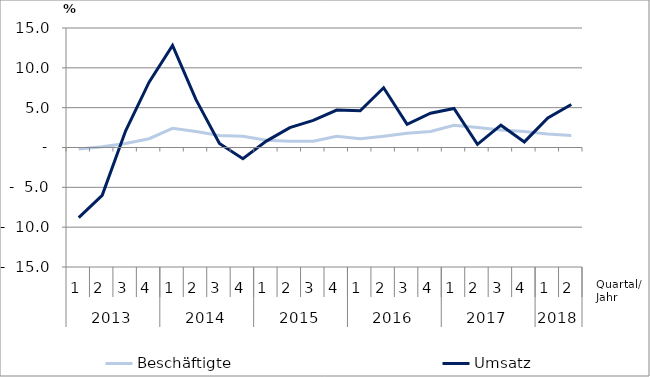
| Category | Beschäftigte | Umsatz |
|---|---|---|
| 0 | -0.2 | -8.8 |
| 1 | 0.1 | -6 |
| 2 | 0.5 | 2.1 |
| 3 | 1.1 | 8.2 |
| 4 | 2.4 | 12.8 |
| 5 | 2 | 6 |
| 6 | 1.5 | 0.5 |
| 7 | 1.4 | -1.4 |
| 8 | 0.9 | 0.8 |
| 9 | 0.8 | 2.5 |
| 10 | 0.8 | 3.4 |
| 11 | 1.4 | 4.7 |
| 12 | 1.1 | 4.6 |
| 13 | 1.4 | 7.5 |
| 14 | 1.8 | 2.9 |
| 15 | 2 | 4.3 |
| 16 | 2.8 | 4.9 |
| 17 | 2.5 | 0.4 |
| 18 | 2.2 | 2.8 |
| 19 | 2 | 0.7 |
| 20 | 1.7 | 3.7 |
| 21 | 1.5 | 5.4 |